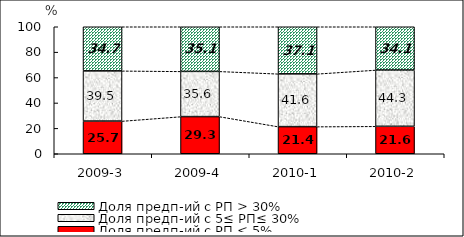
| Category | Доля предп-ий с РП < 5% | Доля предп-ий с 5≤ РП≤ 30% | Доля предп-ий с РП > 30% |
|---|---|---|---|
| 2009-3 | 25.743 | 39.532 | 34.725 |
| 2009-4 | 29.26 | 35.611 | 35.129 |
| 2010-1 | 21.368 | 41.56 | 37.073 |
| 2010-2 | 21.622 | 44.324 | 34.054 |